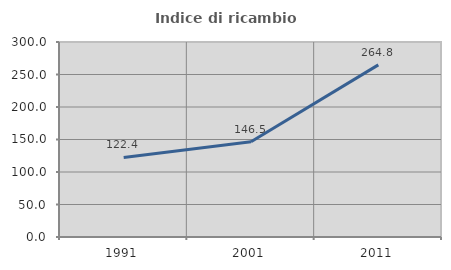
| Category | Indice di ricambio occupazionale  |
|---|---|
| 1991.0 | 122.428 |
| 2001.0 | 146.455 |
| 2011.0 | 264.78 |